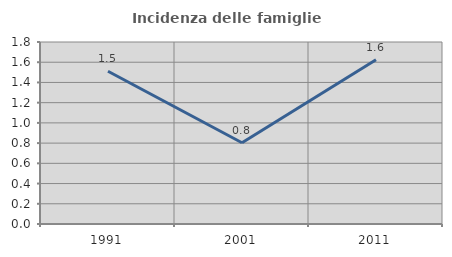
| Category | Incidenza delle famiglie numerose |
|---|---|
| 1991.0 | 1.51 |
| 2001.0 | 0.803 |
| 2011.0 | 1.625 |